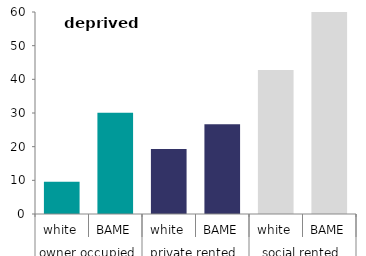
| Category | deprived areas |
|---|---|
| 0 | 9.554 |
| 1 | 30.038 |
| 2 | 19.329 |
| 3 | 26.638 |
| 4 | 42.767 |
| 5 | 60.973 |